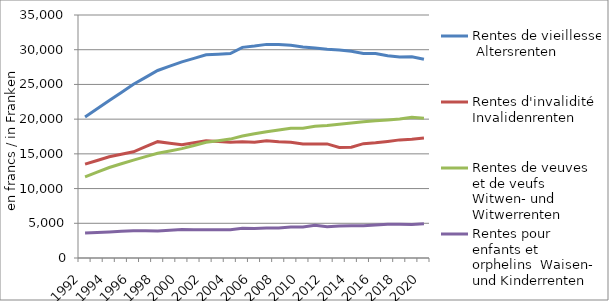
| Category | Rentes de vieillesse | Rentes d'invalidité | Rentes de veuves et de veufs | Rentes pour enfants et orphelins |
|---|---|---|---|---|
| 1992.0 | 20318.578 | 13515.521 | 11697.651 | 3616.695 |
| 1993.0 | 21495.224 | 14050.947 | 12365.232 | 3688.76 |
| 1994.0 | 22671.87 | 14586.374 | 13032.814 | 3760.825 |
| 1995.0 | 23849.442 | 14940.988 | 13568.722 | 3845.447 |
| 1996.0 | 25027.015 | 15295.603 | 14104.631 | 3930.069 |
| 1997.0 | 26018.537 | 16027.568 | 14599.936 | 3915.66 |
| 1998.0 | 27010.059 | 16759.534 | 15095.242 | 3901.251 |
| 1999.0 | 27626.991 | 16540.424 | 15425.31 | 3995.917 |
| 2000.0 | 28243.924 | 16321.314 | 15755.378 | 4090.582 |
| 2001.0 | 28755.946 | 16604.668 | 16208.651 | 4074.15 |
| 2002.0 | 29267.969 | 16888.021 | 16661.923 | 4057.717 |
| 2003.0 | 29352.908 | 16772.638 | 16893.587 | 4060.071 |
| 2004.0 | 29437.847 | 16657.254 | 17125.251 | 4062.424 |
| 2005.0 | 30339.475 | 16759.768 | 17563.642 | 4273.703 |
| 2006.0 | 30522.174 | 16677.413 | 17895.933 | 4263.208 |
| 2007.0 | 30768.299 | 16899.235 | 18195.015 | 4318.218 |
| 2008.0 | 30752.084 | 16758.339 | 18438.556 | 4325.07 |
| 2009.0 | 30629.877 | 16677.06 | 18692.856 | 4458.578 |
| 2010.0 | 30397.034 | 16425.058 | 18700.069 | 4472.367 |
| 2011.0 | 30233.013 | 16417.432 | 18980.449 | 4713.512 |
| 2012.0 | 30057.997 | 16431.193 | 19097.714 | 4517.676 |
| 2013.0 | 29943.615 | 15914.682 | 19265.806 | 4621.466 |
| 2014.0 | 29783.204 | 15959.178 | 19441.274 | 4643.631 |
| 2015.0 | 29471.203 | 16468.063 | 19640.403 | 4641.04 |
| 2016.0 | 29451.131 | 16585.004 | 19780.163 | 4761.81 |
| 2017.0 | 29118.629 | 16794.673 | 19888.264 | 4862.025 |
| 2018.0 | 28947.073 | 17012.459 | 20008.082 | 4878.907 |
| 2019.0 | 28972.791 | 17105.23 | 20256.432 | 4834.765 |
| 2020.0 | 28617.765 | 17273.418 | 20125.772 | 4937.323 |